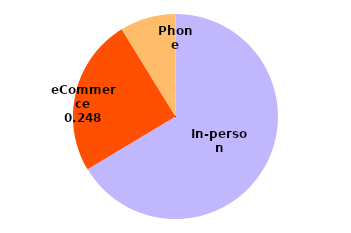
| Category | Series 0 |
|---|---|
| In-person | 83 |
| eCommerce | 31 |
| Phone | 11 |